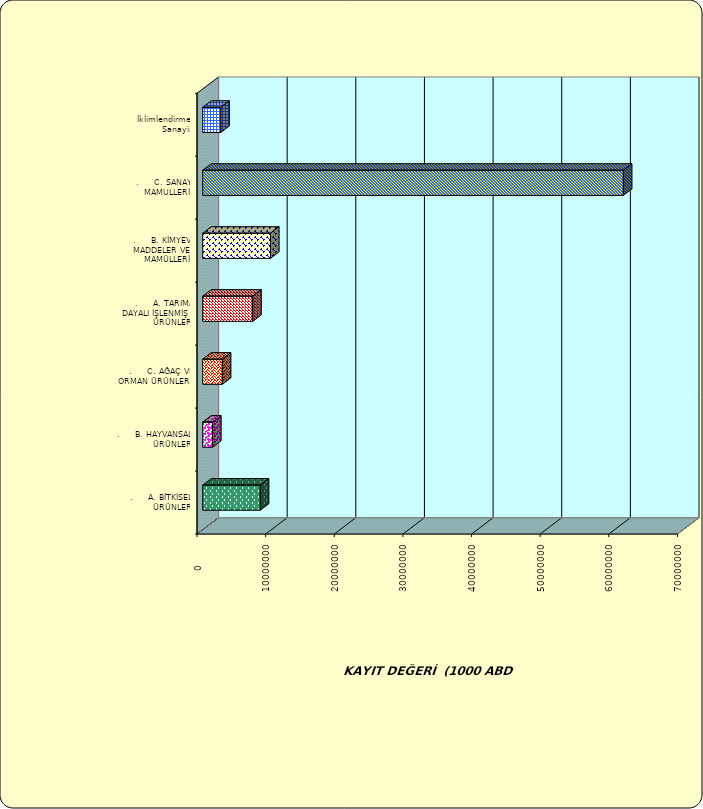
| Category | Series 0 |
|---|---|
| .     A. BİTKİSEL ÜRÜNLER | 8391657.776 |
| .     B. HAYVANSAL ÜRÜNLER | 1433748.173 |
| .     C. AĞAÇ VE ORMAN ÜRÜNLERİ | 2858297.937 |
| .     A. TARIMA DAYALI İŞLENMİŞ ÜRÜNLER | 7286255.413 |
| .     B. KİMYEVİ MADDELER VE MAMÜLLERİ | 9877205.345 |
| .     C. SANAYİ MAMULLERİ | 61288029.531 |
|  İklimlendirme Sanayii | 2632791.396 |